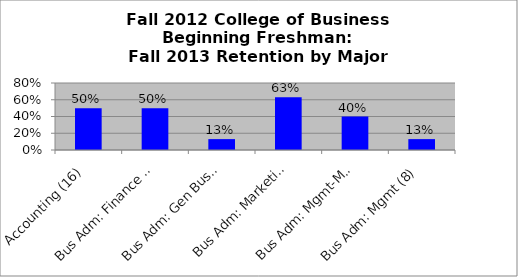
| Category | Series 0 |
|---|---|
| Accounting (16) | 0.5 |
| Bus Adm: Finance (6) | 0.5 |
| Bus Adm: Gen Business (24) | 0.13 |
| Bus Adm: Marketing (8) | 0.63 |
| Bus Adm: Mgmt-MIS (5) | 0.4 |
| Bus Adm: Mgmt (8) | 0.13 |